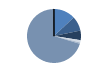
| Category | Series 0 |
|---|---|
| ARRASTRE | 129 |
| CERCO | 87 |
| PALANGRE | 57 |
| REDES DE ENMALLE | 14 |
| ARTES FIJAS | 8 |
| ARTES MENORES | 697 |
| SIN TIPO ASIGNADO | 1 |